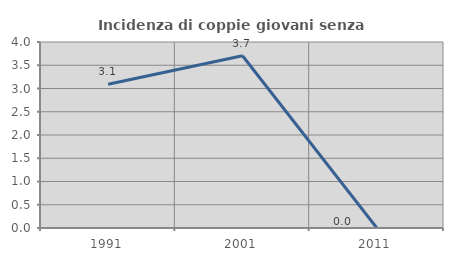
| Category | Incidenza di coppie giovani senza figli |
|---|---|
| 1991.0 | 3.093 |
| 2001.0 | 3.704 |
| 2011.0 | 0 |